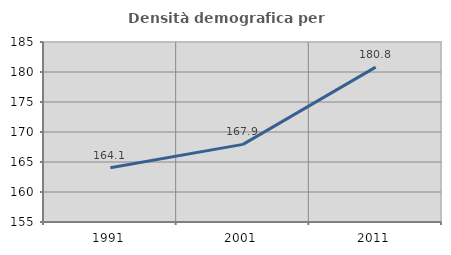
| Category | Densità demografica |
|---|---|
| 1991.0 | 164.057 |
| 2001.0 | 167.939 |
| 2011.0 | 180.809 |